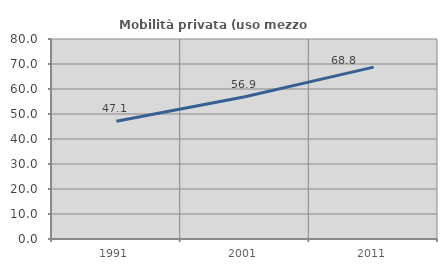
| Category | Mobilità privata (uso mezzo privato) |
|---|---|
| 1991.0 | 47.134 |
| 2001.0 | 56.918 |
| 2011.0 | 68.75 |